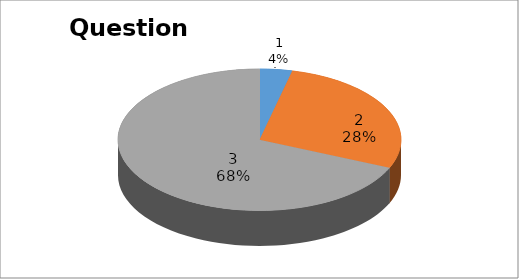
| Category | Series 0 |
|---|---|
| 0 | 2 |
| 1 | 15 |
| 2 | 37 |